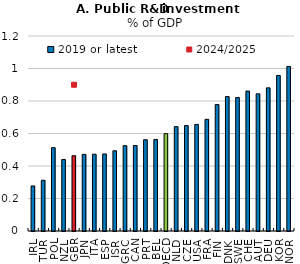
| Category | 2019 or latest |
|---|---|
| IRL | 0.277 |
| TUR | 0.312 |
| POL | 0.513 |
| NZL | 0.44 |
| GBR | 0.463 |
| JPN | 0.472 |
| ITA | 0.472 |
| ESP | 0.474 |
| ISR | 0.494 |
| GRC | 0.525 |
| CAN | 0.526 |
| PRT | 0.562 |
| BEL | 0.563 |
| OECD | 0.599 |
| NLD | 0.642 |
| CZE | 0.649 |
| USA | 0.656 |
| FRA | 0.687 |
| FIN | 0.778 |
| DNK | 0.828 |
| SWE | 0.821 |
| CHE | 0.861 |
| AUT | 0.844 |
| DEU | 0.881 |
| KOR | 0.957 |
| NOR | 1.013 |